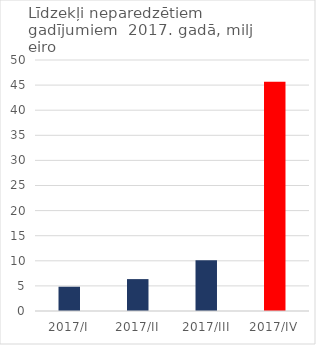
| Category | Series 0 |
|---|---|
| 2017/I | 4.835 |
| 2017/II | 6.354 |
| 2017/III | 10.12 |
| 2017/IV | 45.643 |